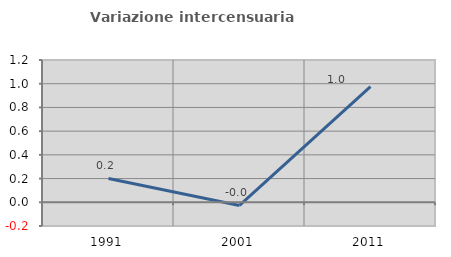
| Category | Variazione intercensuaria annua |
|---|---|
| 1991.0 | 0.201 |
| 2001.0 | -0.026 |
| 2011.0 | 0.976 |